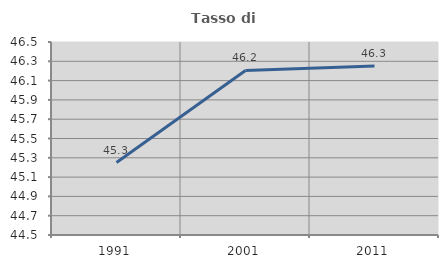
| Category | Tasso di occupazione   |
|---|---|
| 1991.0 | 45.251 |
| 2001.0 | 46.205 |
| 2011.0 | 46.252 |